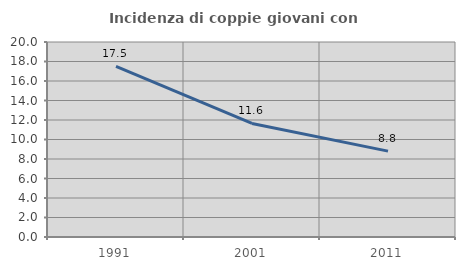
| Category | Incidenza di coppie giovani con figli |
|---|---|
| 1991.0 | 17.503 |
| 2001.0 | 11.648 |
| 2011.0 | 8.805 |